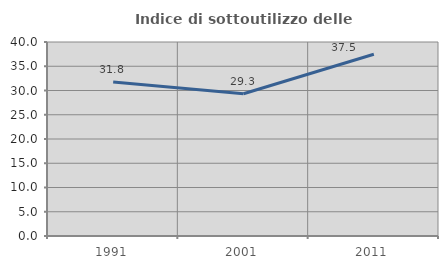
| Category | Indice di sottoutilizzo delle abitazioni  |
|---|---|
| 1991.0 | 31.753 |
| 2001.0 | 29.333 |
| 2011.0 | 37.471 |